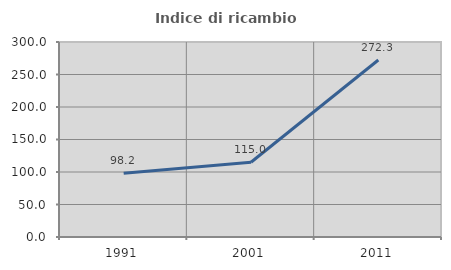
| Category | Indice di ricambio occupazionale  |
|---|---|
| 1991.0 | 98.214 |
| 2001.0 | 115 |
| 2011.0 | 272.316 |